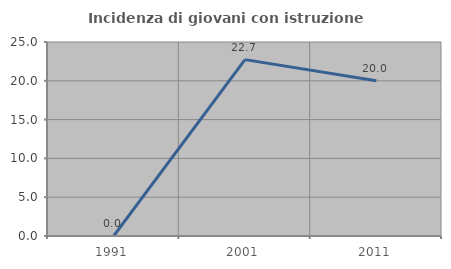
| Category | Incidenza di giovani con istruzione universitaria |
|---|---|
| 1991.0 | 0 |
| 2001.0 | 22.727 |
| 2011.0 | 20 |